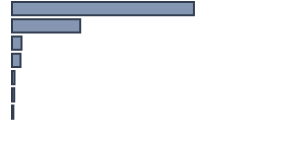
| Category | Series 0 |
|---|---|
| 0 | 66.4 |
| 1 | 24.9 |
| 2 | 3.5 |
| 3 | 3.1 |
| 4 | 0.9 |
| 5 | 0.8 |
| 6 | 0.5 |
| 7 | 0 |